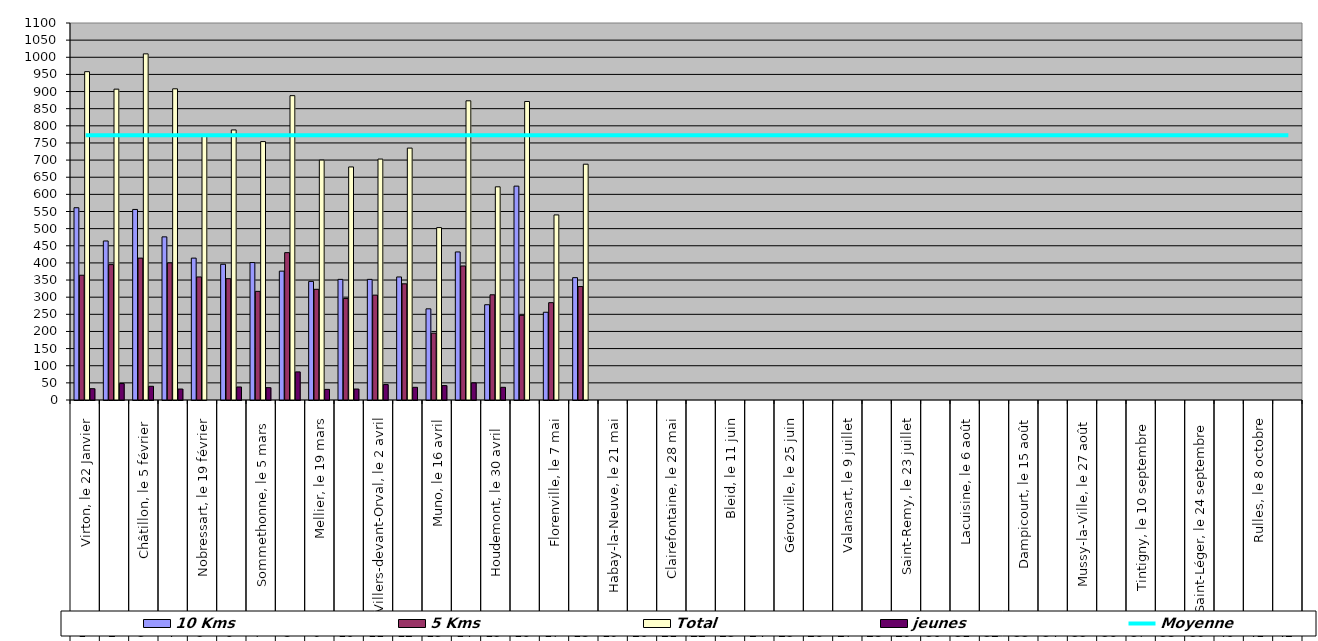
| Category | 10 Kms | 5 Kms | Total | jeunes |
|---|---|---|---|---|
| 0 | 561 | 364 | 958 | 33 |
| 1 | 464 | 395 | 907 | 48 |
| 2 | 556 | 414 | 1010 | 40 |
| 3 | 476 | 400 | 908 | 32 |
| 4 | 414 | 359 | 773 | 0 |
| 5 | 396 | 354 | 788 | 38 |
| 6 | 401 | 317 | 754 | 36 |
| 7 | 376 | 430 | 888 | 82 |
| 8 | 346 | 323 | 700 | 31 |
| 9 | 352 | 296 | 680 | 32 |
| 10 | 352 | 306 | 703 | 45 |
| 11 | 359 | 339 | 735 | 37 |
| 12 | 266 | 195 | 503 | 42 |
| 13 | 432 | 391 | 873 | 50 |
| 14 | 278 | 307 | 622 | 37 |
| 15 | 624 | 247 | 871 | 0 |
| 16 | 256 | 284 | 540 | 0 |
| 17 | 357 | 331 | 688 | 0 |
| 18 | 0 | 0 | 0 | 0 |
| 19 | 0 | 0 | 0 | 0 |
| 20 | 0 | 0 | 0 | 0 |
| 21 | 0 | 0 | 0 | 0 |
| 22 | 0 | 0 | 0 | 0 |
| 23 | 0 | 0 | 0 | 0 |
| 24 | 0 | 0 | 0 | 0 |
| 25 | 0 | 0 | 0 | 0 |
| 26 | 0 | 0 | 0 | 0 |
| 27 | 0 | 0 | 0 | 0 |
| 28 | 0 | 0 | 0 | 0 |
| 29 | 0 | 0 | 0 | 0 |
| 30 | 0 | 0 | 0 | 0 |
| 31 | 0 | 0 | 0 | 0 |
| 32 | 0 | 0 | 0 | 0 |
| 33 | 0 | 0 | 0 | 0 |
| 34 | 0 | 0 | 0 | 0 |
| 35 | 0 | 0 | 0 | 0 |
| 36 | 0 | 0 | 0 | 0 |
| 37 | 0 | 0 | 0 | 0 |
| 38 | 0 | 0 | 0 | 0 |
| 39 | 0 | 0 | 0 | 0 |
| 40 | 0 | 0 | 0 | 0 |
| 41 | 0 | 0 | 0 | 0 |